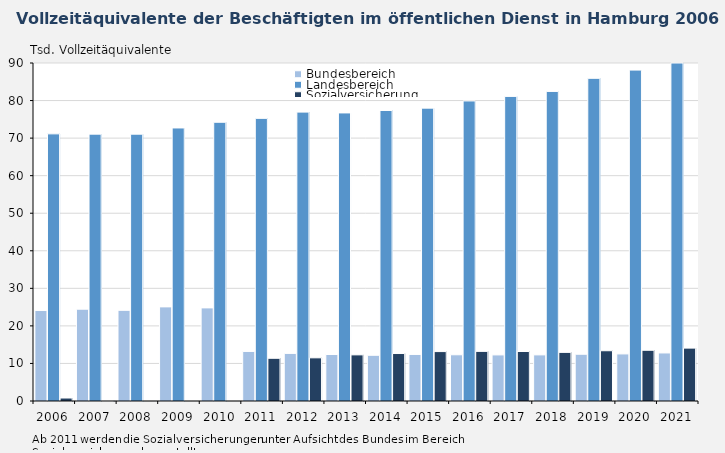
| Category | Bundesbereich | Landesbereich | Sozialversicherung |
|---|---|---|---|
| 2006.0 | 24.091 | 71.132 | 0.792 |
| 2007.0 | 24.443 | 71.054 | 0.075 |
| 2008.0 | 24.137 | 71.045 | 0 |
| 2009.0 | 25.062 | 72.703 | 0 |
| 2010.0 | 24.79 | 74.216 | 0 |
| 2011.0 | 13.19 | 75.256 | 11.372 |
| 2012.0 | 12.669 | 76.923 | 11.495 |
| 2013.0 | 12.379 | 76.705 | 12.284 |
| 2014.0 | 12.173 | 77.353 | 12.643 |
| 2015.0 | 12.39 | 77.981 | 13.156 |
| 2016.0 | 12.303 | 79.896 | 13.21 |
| 2017.0 | 12.272 | 81.109 | 13.178 |
| 2018.0 | 12.278 | 82.429 | 12.946 |
| 2019.0 | 12.448 | 85.922 | 13.384 |
| 2020.0 | 12.535 | 88.115 | 13.505 |
| 2021.0 | 12.793 | 90.656 | 14.084 |